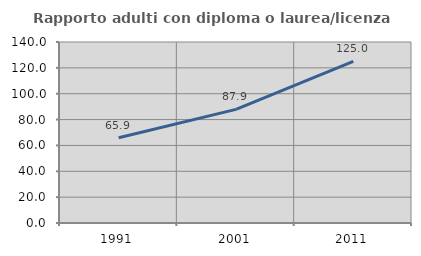
| Category | Rapporto adulti con diploma o laurea/licenza media  |
|---|---|
| 1991.0 | 65.891 |
| 2001.0 | 87.888 |
| 2011.0 | 125 |